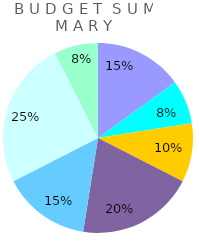
| Category | Series 0 |
|---|---|
| 0 |  |
| 1 |  |
| 2 |  |
| 3 |  |
| 4 |  |
| 5 |  |
| 6 |  |